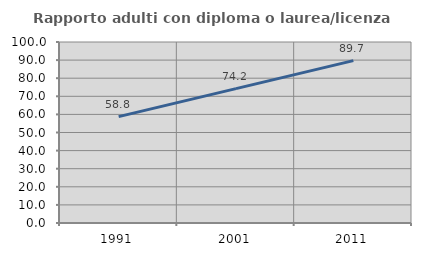
| Category | Rapporto adulti con diploma o laurea/licenza media  |
|---|---|
| 1991.0 | 58.771 |
| 2001.0 | 74.239 |
| 2011.0 | 89.724 |